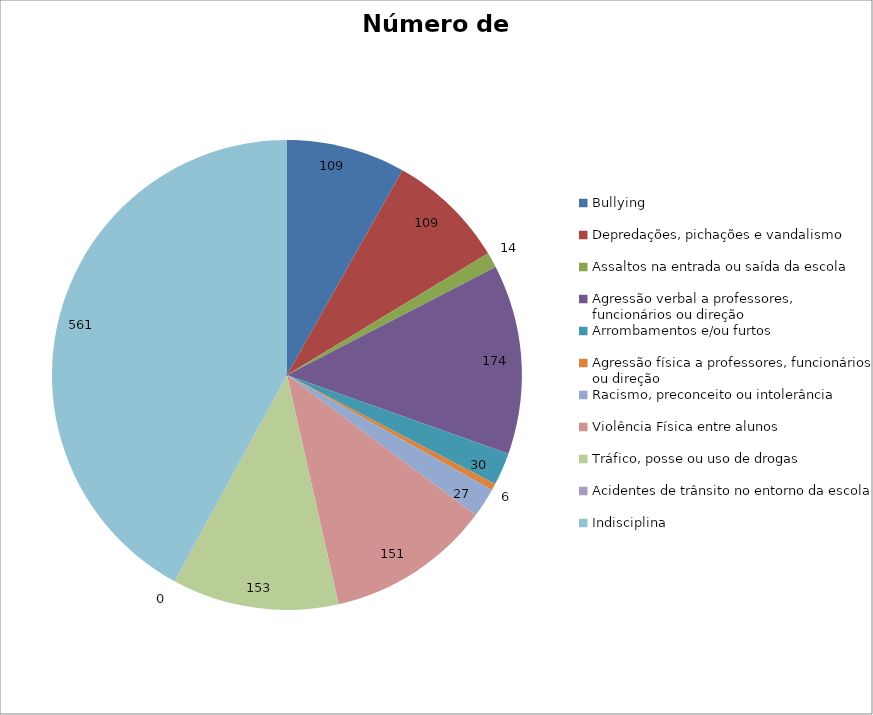
| Category | Número de Casos |
|---|---|
| Bullying | 109 |
| Depredações, pichações e vandalismo | 109 |
| Assaltos na entrada ou saída da escola | 14 |
| Agressão verbal a professores, funcionários ou direção | 174 |
| Arrombamentos e/ou furtos | 30 |
| Agressão física a professores, funcionários ou direção | 6 |
| Racismo, preconceito ou intolerância | 27 |
| Violência Física entre alunos | 151 |
| Tráfico, posse ou uso de drogas | 153 |
| Acidentes de trânsito no entorno da escola | 0 |
| Indisciplina | 561 |